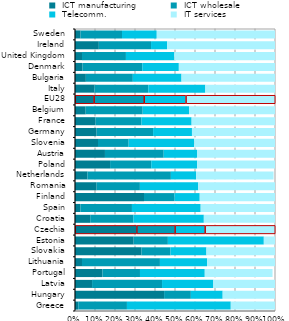
| Category |  ICT manufacturing |  ICT wholesale |  Telecomm. |  IT services |
|---|---|---|---|---|
| Greece | 0.016 | 0.243 | 0.519 | 0.221 |
| Hungary | 0.445 | 0.134 | 0.159 | 0.262 |
| Latvia | 0.085 | 0.35 | 0.256 | 0.308 |
| Portugal | 0.137 | 0.188 | 0.324 | 0.339 |
| Lithuania | 0.035 | 0.39 | 0.236 | 0.339 |
| Slovakia | 0.332 | 0.145 | 0.18 | 0.343 |
| Estonia | 0.293 | 0.171 | 0.48 | 0.349 |
| Czechia | 0.308 | 0.191 | 0.15 | 0.35 |
| Croatia | 0.076 | 0.216 | 0.352 | 0.356 |
| Spain | 0.027 | 0.258 | 0.344 | 0.372 |
| Finland | 0.345 | 0.153 | 0.126 | 0.376 |
| Romania | 0.108 | 0.216 | 0.292 | 0.384 |
| Netherlands | 0.062 | 0.417 | 0.126 | 0.387 |
| Poland | 0.175 | 0.206 | 0.23 | 0.389 |
| Austria | 0.15 | 0.294 | 0.166 | 0.39 |
| Slovenia | 0.115 | 0.153 | 0.328 | 0.404 |
| Germany | 0.108 | 0.282 | 0.194 | 0.415 |
| France | 0.102 | 0.23 | 0.251 | 0.417 |
| Belgium | 0.053 | 0.285 | 0.232 | 0.43 |
| EU28 | 0.094 | 0.251 | 0.209 | 0.446 |
| Italy | 0.097 | 0.269 | 0.285 | 0.446 |
| Bulgaria | 0.054 | 0.235 | 0.243 | 0.467 |
| Denmark | 0.038 | 0.299 | 0.183 | 0.481 |
| United Kingdom | 0.035 | 0.22 | 0.242 | 0.503 |
| Ireland | 0.119 | 0.261 | 0.08 | 0.539 |
| Sweden | 0.028 | 0.207 | 0.174 | 0.591 |